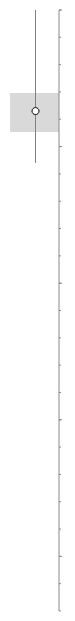
| Category | Series 0 | Series 1 |
|---|---|---|
| 0 | 45.25 | 31 |